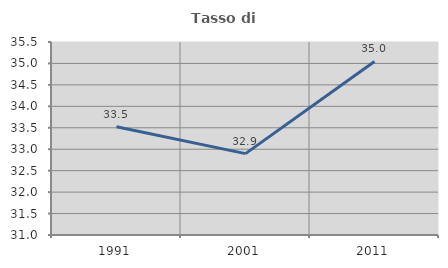
| Category | Tasso di occupazione   |
|---|---|
| 1991.0 | 33.524 |
| 2001.0 | 32.897 |
| 2011.0 | 35.046 |